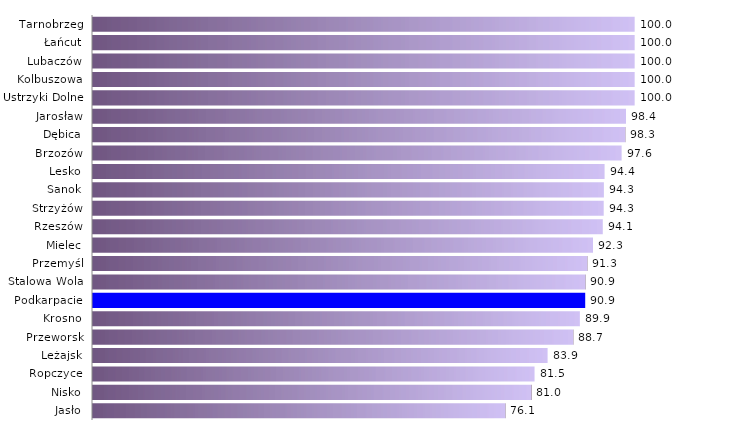
| Category | Refundacja kosztów wyposażenia i doposażenia stanowiska pracy |
|---|---|
| Jasło | 76.136 |
| Nisko | 80.952 |
| Ropczyce | 81.522 |
| Leżajsk | 83.929 |
| Przeworsk | 88.679 |
| Krosno | 89.888 |
| Podkarpacie | 90.869 |
| Stalowa Wola | 90.909 |
| Przemyśl | 91.27 |
| Mielec | 92.308 |
| Rzeszów | 94.118 |
| Strzyżów | 94.286 |
| Sanok | 94.318 |
| Lesko | 94.444 |
| Brzozów | 97.59 |
| Dębica | 98.276 |
| Jarosław | 98.4 |
| Ustrzyki Dolne | 100 |
| Kolbuszowa | 100 |
| Lubaczów | 100 |
| Łańcut | 100 |
| Tarnobrzeg | 100 |